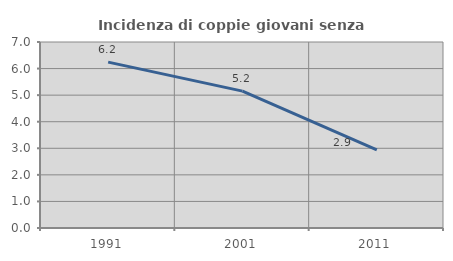
| Category | Incidenza di coppie giovani senza figli |
|---|---|
| 1991.0 | 6.242 |
| 2001.0 | 5.151 |
| 2011.0 | 2.941 |